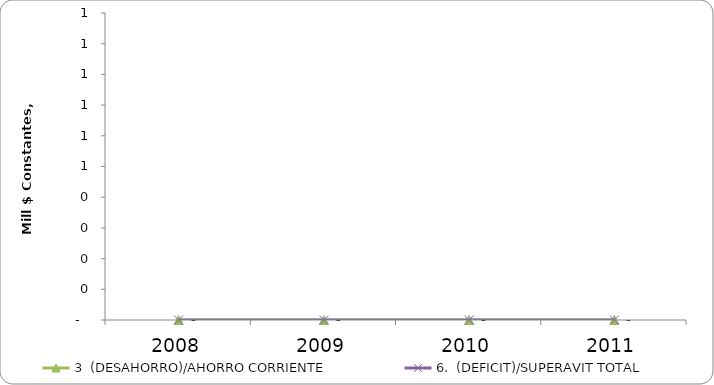
| Category | 3  (DESAHORRO)/AHORRO CORRIENTE | 6.  (DEFICIT)/SUPERAVIT TOTAL |
|---|---|---|
| 2008.0 | 0 | 0 |
| 2009.0 | 0 | 0 |
| 2010.0 | 0 | 0 |
| 2011.0 | 0 | 0 |